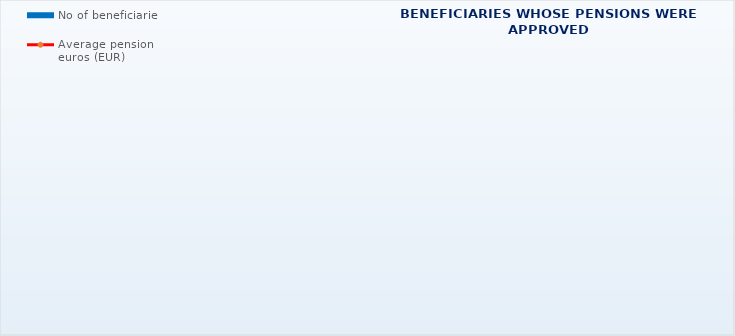
| Category | No of beneficiaries |
|---|---|
| Authorised officials in internal affairs, judicial officers and workers engaged in demining work: | 17183 |
| Pension beneficiaries entitled under the Fire Services Act (Official Gazette 125/19) | 394 |
| Active military personnel - DVO  | 16187 |
| Croatian Homeland Army veterans mobilised from 1941 to 1945 | 1650 |
| Former political prisoners | 1959 |
| Croatian Veterans from the Homeland War - ZOHBDR (Act on Croatian Homeland War Veterans and Their Family Members) | 71529 |
| Pensions approved under general regulations and determined according to the Act on the Rights of Croatian Homeland War Veterans and their Family Members (ZOHBDR), in 2017 (Art. 27, 35, 48 and 49, paragraph 2)    | 59900 |
| Former Yugoslav People's Army members - JNA   | 3388 |
| Former Yugoslav People's Army members - JNA - Art. 185 of Pension Insurance Act (ZOMO)  | 153 |
| National Liberation War veterans - NOR | 4432 |
| Members of the Croatian Parliament, members of the Government, judges of the Constitutional Court and the Auditor General | 685 |
| Members of the Parliamentary Executive Council and administratively retired federal civil servants  (relates to the former SFRY) | 60 |
| Former officials of federal bodies o the former SFRJ -  Article 38 of the Pension Insurance Act (ZOMO) | 17 |
| Full members of the Croatian Academy of Sciences and Arts - HAZU | 120 |
| Miners from the Istrian coal mines "Tupljak" d.d. Labin  | 244 |
| Workers professionally exposed to asbestos | 811 |
| Insurees - crew members on a ship in international and national navigation  - Article  129, paragraph 2 of the Maritime Code | 209 |
| Pension beneficiaries entitled according to the Theaters Act (Official Gazette 23/23) | 5 |
| Members of the Croatian Defence Council - HVO  | 7236 |